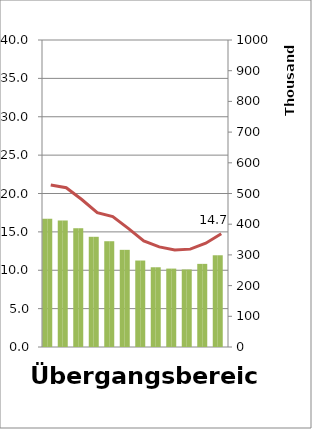
| Category | absolut | relativ |
|---|---|---|
| 0 | 417649 | 21.12 |
| 1 | 412083 | 20.751 |
| 2 | 386864 | 19.22 |
| 3 | 358969 | 17.509 |
| 4 | 344515 | 16.991 |
| 5 | 316494 | 15.449 |
| 6 | 281662 | 13.823 |
| 7 | 259727 | 13.046 |
| 8 | 255401 | 12.637 |
| 9 | 252670 | 12.751 |
| 10 | 270783 | 13.525 |
| 11 | 298781.431 | 14.746 |